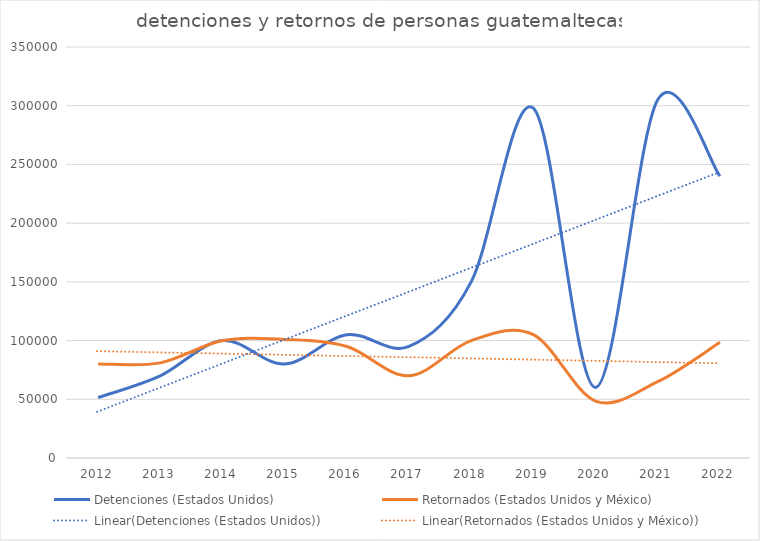
| Category | Detenciones (Estados Unidos) | Retornados (Estados Unidos y México) |
|---|---|---|
| 2012.0 | 51500 | 80000 |
| 2013.0 | 70000 | 81000 |
| 2014.0 | 100000 | 100000 |
| 2015.0 | 80000 | 101000 |
| 2016.0 | 105000 | 95000 |
| 2017.0 | 95000 | 70000 |
| 2018.0 | 150000 | 100000 |
| 2019.0 | 298000 | 105000 |
| 2020.0 | 60000 | 48500 |
| 2021.0 | 305000 | 65000 |
| 2022.0 | 240000 | 98500 |